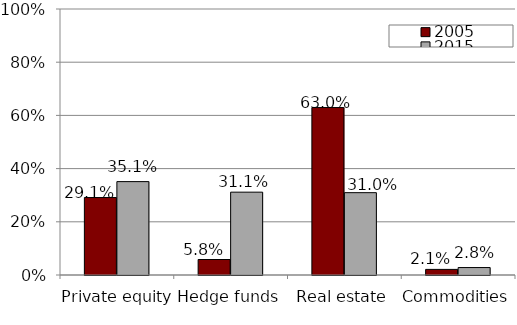
| Category | 2005 | 2015 |
|---|---|---|
| Private equity | 0.291 | 0.351 |
| Hedge funds | 0.058 | 0.311 |
| Real estate | 0.63 | 0.31 |
| Commodities | 0.021 | 0.028 |